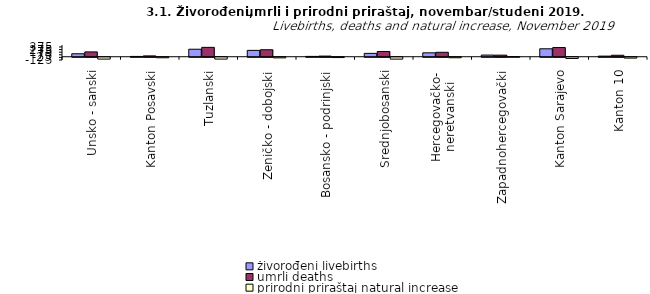
| Category | živorođeni livebirths | umrli deaths | prirodni priraštaj natural increase |
|---|---|---|---|
| Unsko - sanski | 114 | 185 | -71 |
| Kanton Posavski | 12 | 32 | -20 |
| Tuzlanski | 288 | 359 | -71 |
| Zeničko - dobojski | 244 | 268 | -24 |
| Bosansko - podrinjski | 13 | 25 | -12 |
| Srednjobosanski | 129 | 201 | -72 |
| Hercegovačko-
neretvanski | 150 | 170 | -20 |
| Zapadnohercegovački | 64 | 61 | 3 |
| Kanton Sarajevo | 305 | 352 | -47 |
| Kanton 10 | 24 | 57 | -33 |